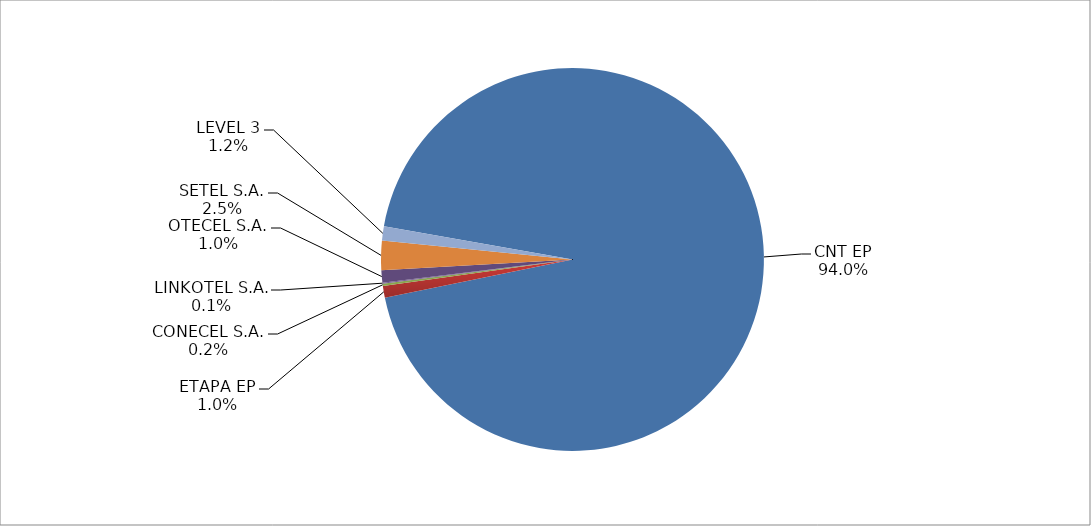
| Category | Series 0 |
|---|---|
| CNT EP | 2453 |
| ETAPA EP | 26 |
| CONECEL S.A. | 5 |
| LINKOTEL S.A. | 2 |
| OTECEL S.A. | 27 |
| SETEL S.A. | 65 |
| LEVEL 3 | 31 |